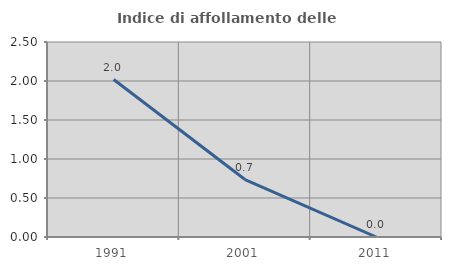
| Category | Indice di affollamento delle abitazioni  |
|---|---|
| 1991.0 | 2.019 |
| 2001.0 | 0.737 |
| 2011.0 | 0 |